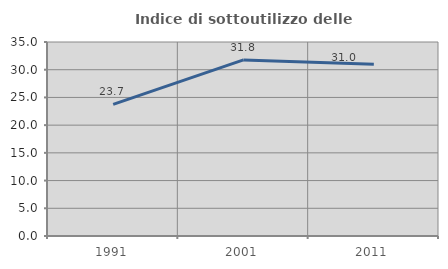
| Category | Indice di sottoutilizzo delle abitazioni  |
|---|---|
| 1991.0 | 23.747 |
| 2001.0 | 31.765 |
| 2011.0 | 30.999 |